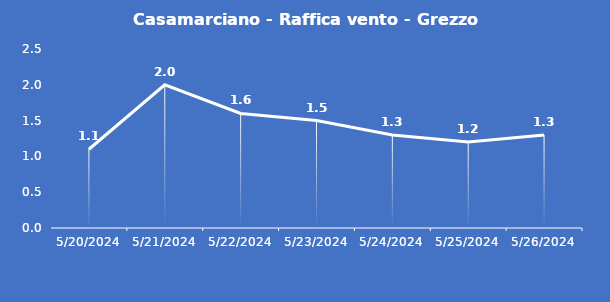
| Category | Casamarciano - Raffica vento - Grezzo (m/s) |
|---|---|
| 5/20/24 | 1.1 |
| 5/21/24 | 2 |
| 5/22/24 | 1.6 |
| 5/23/24 | 1.5 |
| 5/24/24 | 1.3 |
| 5/25/24 | 1.2 |
| 5/26/24 | 1.3 |